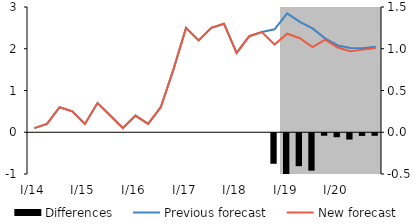
| Category | Differences |
|---|---|
| 0 | 0 |
| 1 | 0 |
| 2 | 0 |
| 3 | 0 |
| 4 | 0 |
| 5 | 0 |
| 6 | 0 |
| 7 | 0 |
| 8 | 0 |
| 9 | 0 |
| 10 | 0 |
| 11 | 0 |
| 12 | 0 |
| 13 | 0 |
| 14 | 0 |
| 15 | 0 |
| 16 | 0 |
| 17 | 0 |
| 18 | 0 |
| 19 | -0.365 |
| 20 | -0.488 |
| 21 | -0.394 |
| 22 | -0.448 |
| 23 | -0.03 |
| 24 | -0.048 |
| 25 | -0.075 |
| 26 | -0.032 |
| 27 | -0.031 |